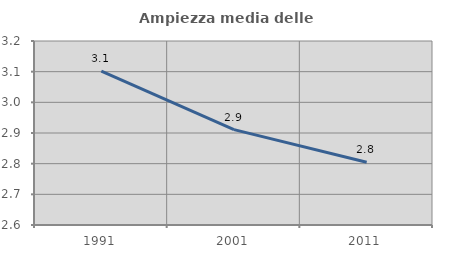
| Category | Ampiezza media delle famiglie |
|---|---|
| 1991.0 | 3.102 |
| 2001.0 | 2.911 |
| 2011.0 | 2.805 |